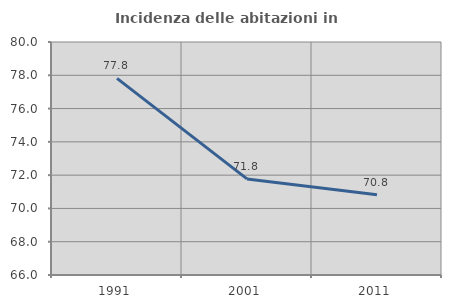
| Category | Incidenza delle abitazioni in proprietà  |
|---|---|
| 1991.0 | 77.813 |
| 2001.0 | 71.773 |
| 2011.0 | 70.826 |